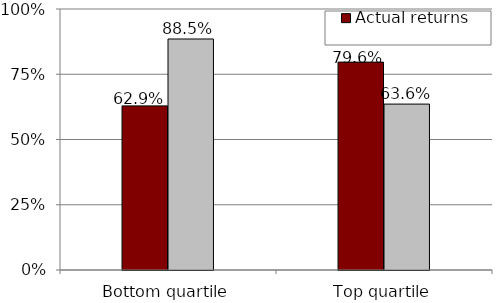
| Category | Actual returns | Alternative returns |
|---|---|---|
| Bottom quartile | 0.629 | 0.885 |
| Top quartile | 0.796 | 0.636 |